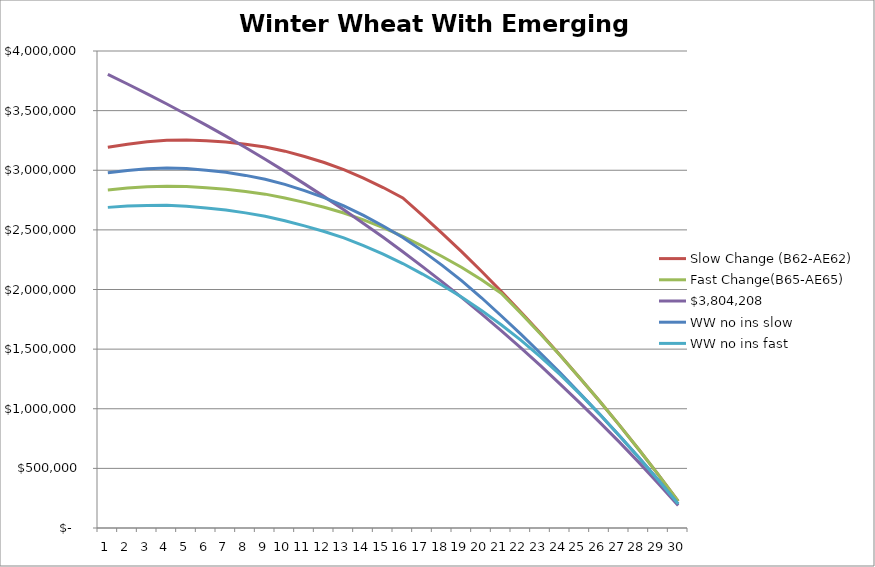
| Category | Slow Change (B62-AE62) | Fast Change(B65-AE65) |  $3,804,208  | WW no ins slow | WW no ins fast |
|---|---|---|---|---|---|
| 0 | 3192488.337 | 2835055.081 | 3804208.32 | 2979405.477 | 2688666.408 |
| 1 | 3218309.275 | 2850153.021 | 3723158.718 | 2998833.929 | 2699372.687 |
| 2 | 3238296.627 | 2860650.35 | 3640749.233 | 3012237.021 | 2705346.607 |
| 3 | 3250918.355 | 2865891.543 | 3555227.111 | 3018076.961 | 2705928.688 |
| 4 | 3253754.975 | 2863537.712 | 3467549.952 | 3013928.339 | 2698775.97 |
| 5 | 3247236.643 | 2853276.938 | 3378698.819 | 3000215.208 | 2683572.344 |
| 6 | 3237022.315 | 2841279.282 | 3285903.824 | 2982590.236 | 2666483.55 |
| 7 | 3218872.023 | 2822676.869 | 3191064.651 | 2956806.983 | 2642637.265 |
| 8 | 3194860.726 | 2799580.944 | 3091829.608 | 2924933.734 | 2614140.152 |
| 9 | 3160029.086 | 2768004.468 | 2990363.114 | 2882004.284 | 2577000.453 |
| 10 | 3115568.058 | 2730669.087 | 2885867.957 | 2829202.512 | 2533934.951 |
| 11 | 3065265.746 | 2689135.866 | 2778825.952 | 2770309.234 | 2486499.706 |
| 12 | 3004794.38 | 2641065.033 | 2667911.803 | 2700989.173 | 2432349.788 |
| 13 | 2934526.558 | 2583727.315 | 2554277.991 | 2621607.194 | 2368750.612 |
| 14 | 2855075.253 | 2518147.497 | 2437940.193 | 2532768.308 | 2296721.494 |
| 15 | 2767796.763 | 2445874.398 | 2317084.461 | 2435820.611 | 2217805.614 |
| 16 | 2621525.347 | 2364326.437 | 2191711.663 | 2324075.057 | 2129415.59 |
| 17 | 2470002.72 | 2277058.328 | 2063791.084 | 2202459.104 | 2035100.156 |
| 18 | 2315077.394 | 2184968.459 | 1931621.096 | 2072826.643 | 1935751.542 |
| 19 | 2152658.531 | 2081382.579 | 1795027.57 | 1930705.352 | 1824689.154 |
| 20 | 1984343.471 | 1968980.83 | 1654413.296 | 1779943.651 | 1704586.603 |
| 21 | 1811847.148 | 1801819.983 | 1511102.661 | 1625290.908 | 1575029.915 |
| 22 | 1632812.902 | 1626593.157 | 1361462.167 | 1465098.359 | 1434329.692 |
| 23 | 1449319.733 | 1445827.368 | 1207046.265 | 1300845.94 | 1285315.111 |
| 24 | 1258530.28 | 1257823.68 | 1049398.607 | 1128959.639 | 1124391.188 |
| 25 | 1064788.033 | 1064788.033 | 887722.216 | 955271.663 | 955271.663 |
| 26 | 864824.739 | 864824.739 | 722250.983 | 775910.081 | 775910.081 |
| 27 | 658508.522 | 658508.522 | 550287.134 | 591041.097 | 591041.097 |
| 28 | 445349.982 | 445349.982 | 371883.517 | 399654.095 | 399654.095 |
| 29 | 225974.631 | 225974.631 | 188596.541 | 202461.118 | 202461.118 |